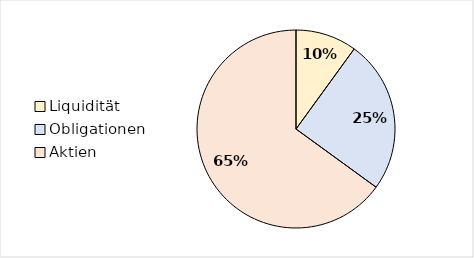
| Category | Series 0 | Series 1 |
|---|---|---|
| Liquidität | 10 | 18000 |
| Obligationen | 25 | 45000 |
| Aktien | 65 | 117000 |